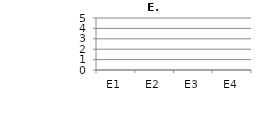
| Category | Gemiddelde |
|---|---|
| E1 | 0 |
| E2 | 0 |
| E3 | 0 |
| E4 | 0 |